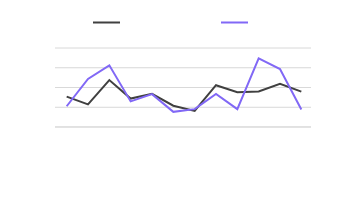
| Category | Previous Year | Current Year |
|---|---|---|
| January | 153984 | 105103 |
| February | 114830 | 243271 |
| March | 237556 | 312458 |
| April | 143986 | 129701 |
| May | 167641 | 166286 |
| June | 107904 | 76713 |
| July | 81203 | 90496 |
| August | 211475 | 167439 |
| September | 175700 | 90389 |
| October | 180287 | 347092 |
| November | 219265 | 293132 |
| December | 178928 | 88944 |